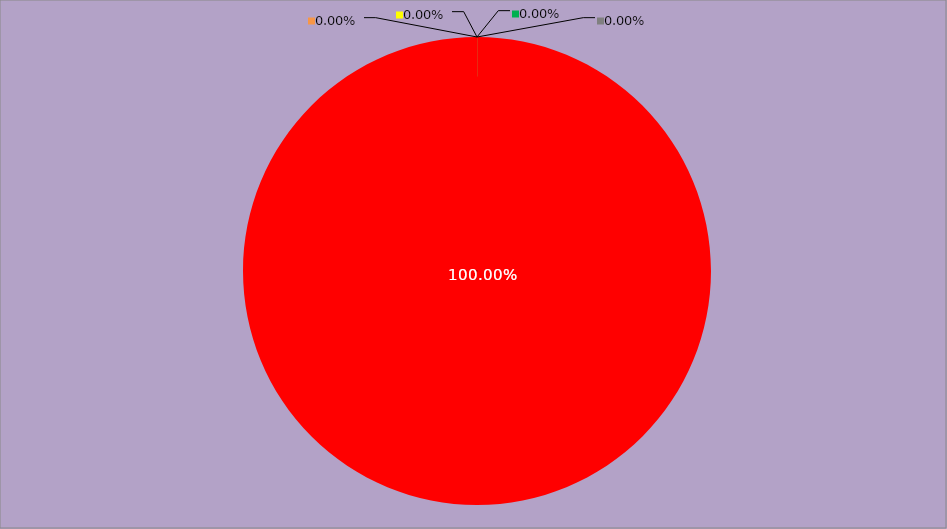
| Category | Année 2023 |
|---|---|
| Mesures non appliquées | 168 |
| Mesures appliquées mais peu ou pas documentées | 0 |
| Mesures appliquées et documentées | 0 |
| Mesures appliquées, documentées et contrôlées | 0 |
| Mesures non applicables | 0 |